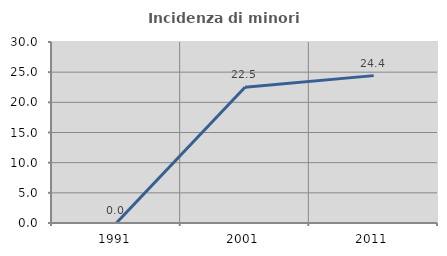
| Category | Incidenza di minori stranieri |
|---|---|
| 1991.0 | 0 |
| 2001.0 | 22.5 |
| 2011.0 | 24.427 |